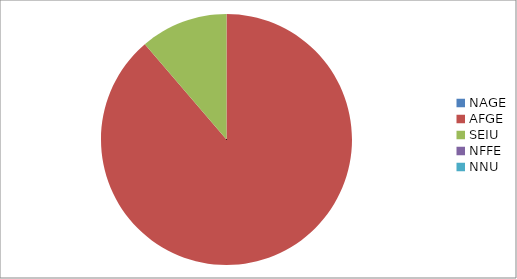
| Category | Series 0 |
|---|---|
| NAGE | 0 |
| AFGE | 10222 |
| SEIU | 1299 |
| NFFE | 0 |
| NNU | 0 |